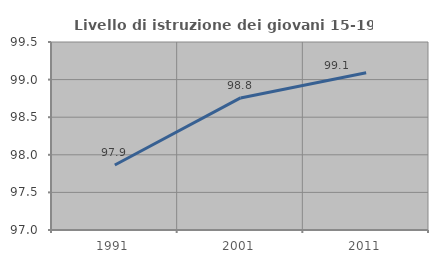
| Category | Livello di istruzione dei giovani 15-19 anni |
|---|---|
| 1991.0 | 97.865 |
| 2001.0 | 98.756 |
| 2011.0 | 99.091 |